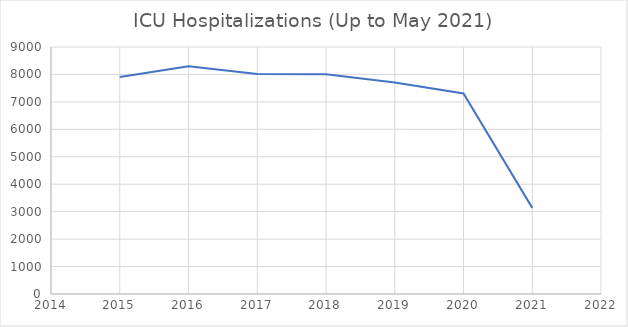
| Category | Series 0 |
|---|---|
| 2015.0 | 7906 |
| 2016.0 | 8300 |
| 2017.0 | 8014 |
| 2018.0 | 8005 |
| 2019.0 | 7708 |
| 2020.0 | 7306 |
| 2021.0 | 3138 |